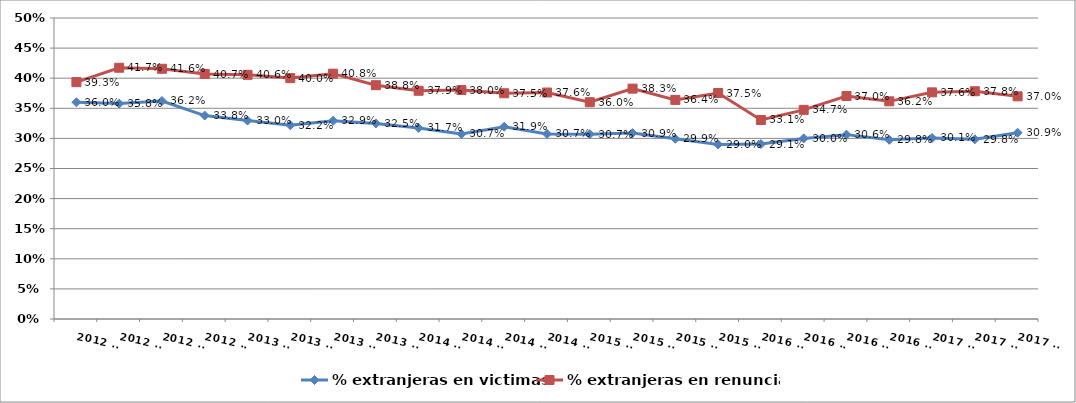
| Category | % extranjeras en victimas | % extranjeras en renuncias |
|---|---|---|
| 2012 T1 | 0.36 | 0.393 |
| 2012 T2 | 0.358 | 0.417 |
| 2012 T3 | 0.362 | 0.416 |
| 2012 T4 | 0.338 | 0.407 |
| 2013 T1 | 0.33 | 0.406 |
| 2013 T2 | 0.322 | 0.4 |
| 2013 T3 | 0.329 | 0.408 |
| 2013 T4 | 0.325 | 0.388 |
| 2014 T1 | 0.317 | 0.379 |
| 2014 T2 | 0.307 | 0.38 |
| 2014 T3 | 0.319 | 0.375 |
| 2014 T4 | 0.307 | 0.376 |
| 2015 T1 | 0.307 | 0.36 |
| 2015 T2 | 0.309 | 0.383 |
| 2015 T3 | 0.299 | 0.364 |
| 2015 T4 | 0.29 | 0.375 |
| 2016 T1 | 0.291 | 0.331 |
| 2016 T2 | 0.3 | 0.347 |
| 2016 T3 | 0.306 | 0.37 |
| 2016 T4 | 0.298 | 0.362 |
| 2017 T1 | 0.301 | 0.376 |
| 2017 T2 | 0.298 | 0.378 |
| 2017 T3 | 0.309 | 0.37 |